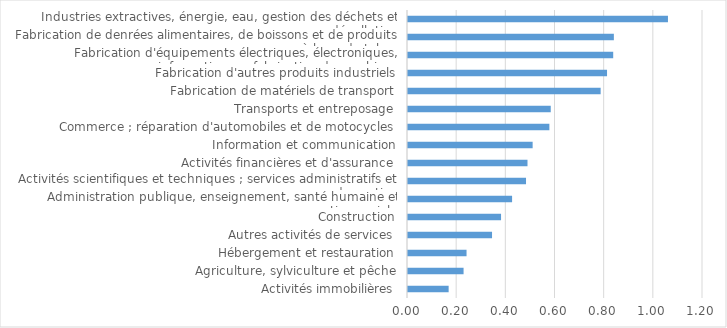
| Category | Part de la valeur ajoutée du secteur |
|---|---|
| Activités immobilières | 0.165 |
| Agriculture, sylviculture et pêche | 0.226 |
| Hébergement et restauration | 0.238 |
| Autres activités de services | 0.342 |
| Construction | 0.379 |
| Administration publique, enseignement, santé humaine et action sociale | 0.423 |
| Activités scientifiques et techniques ; services administratifs et de soutien | 0.48 |
| Activités financières et d'assurance | 0.486 |
| Information et communication | 0.507 |
| Commerce ; réparation d'automobiles et de motocycles | 0.575 |
| Transports et entreposage | 0.581 |
| Fabrication de matériels de transport | 0.784 |
| Fabrication d'autres produits industriels | 0.81 |
| Fabrication d'équipements électriques, électroniques, informatiques ; fabrication de machines | 0.835 |
| Fabrication de denrées alimentaires, de boissons et de produits à base de tabac | 0.837 |
| Industries extractives, énergie, eau, gestion des déchets et dépollution | 1.057 |